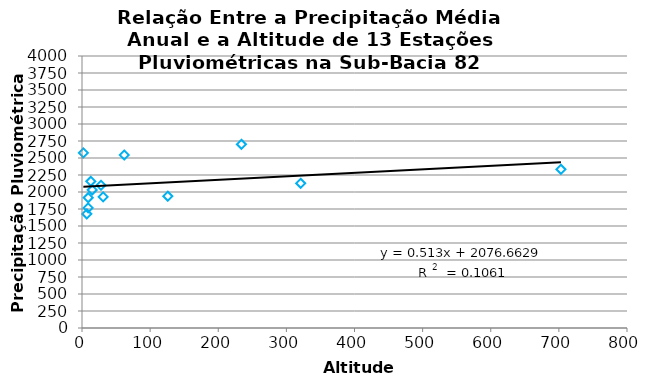
| Category | Series 0 |
|---|---|
| 234.0 | 2701.584 |
| 31.0 | 1928.653 |
| 126.0 | 1938.467 |
| 28.0 | 2099.337 |
| 62.0 | 2543.717 |
| 703.0 | 2334.393 |
| 13.0 | 2157.444 |
| 321.0 | 2127.987 |
| 9.0 | 1916 |
| 15.0 | 2030.185 |
| 2.0 | 2574.953 |
| 9.0 | 1766.229 |
| 7.0 | 1677.943 |